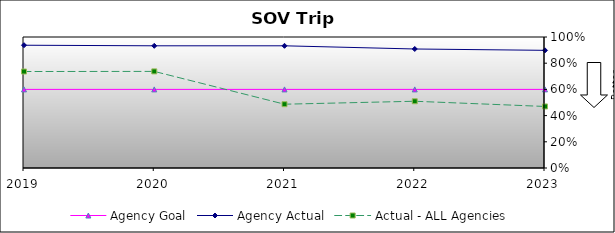
| Category | Agency Goal | Agency Actual | Actual - ALL Agencies |
|---|---|---|---|
| 2019.0 | 0.6 | 0.937 | 0.736 |
| 2020.0 | 0.6 | 0.933 | 0.737 |
| 2021.0 | 0.6 | 0.933 | 0.487 |
| 2022.0 | 0.6 | 0.908 | 0.509 |
| 2023.0 | 0.6 | 0.898 | 0.47 |